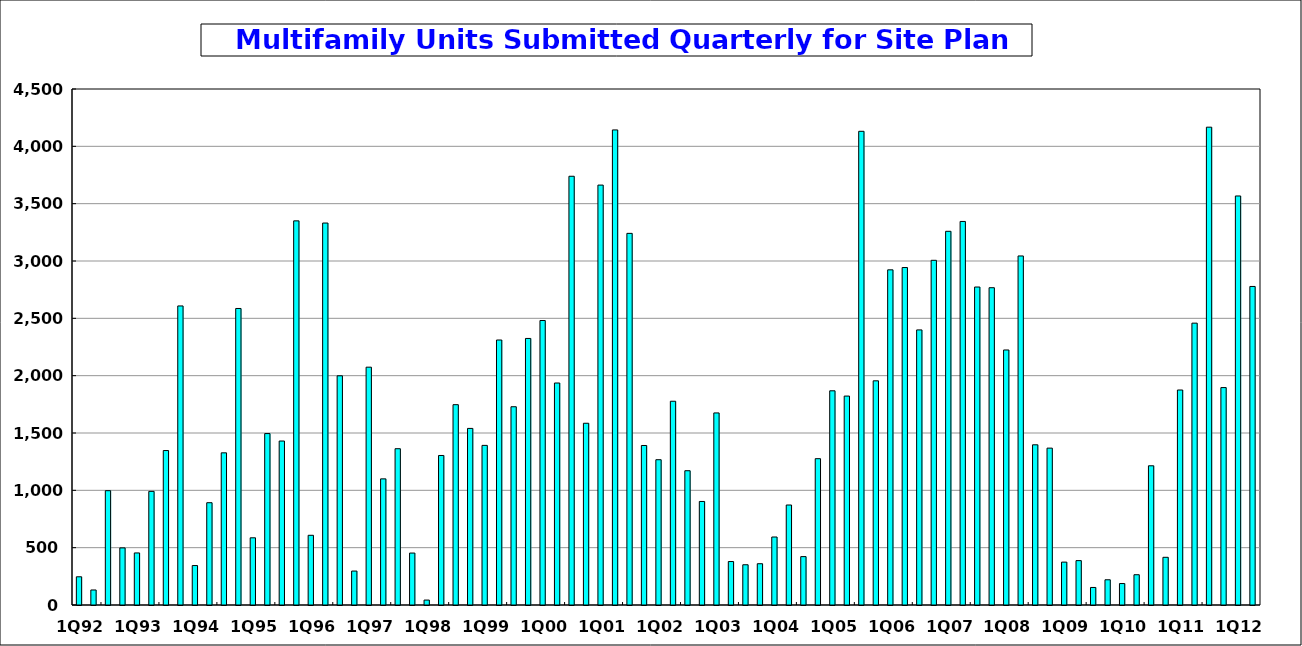
| Category | Series 0 |
|---|---|
| 1Q92 | 246 |
| 2Q92 | 131 |
| 3Q92 | 997 |
| 4Q92 | 498 |
| 1Q93 | 454 |
| 2Q93 | 991 |
| 3Q93 | 1347 |
| 4Q93 | 2608 |
| 1Q94 | 344 |
| 2Q94 | 892 |
| 3Q94 | 1327 |
| 4Q94 | 2586 |
| 1Q95 | 586 |
| 2Q95 | 1495 |
| 3Q95 | 1430 |
| 4Q95 | 3350 |
| 1Q96 | 608 |
| 2Q96 | 3331 |
| 3Q96 | 1999 |
| 4Q96 | 296 |
| 1Q97 | 2074 |
| 2Q97 | 1100 |
| 3Q97 | 1363 |
| 4Q97 | 453 |
| 1Q98 | 43 |
| 2Q98 | 1304 |
| 3Q98 | 1747 |
| 4Q98 | 1540 |
| 1Q99 | 1392 |
| 2Q99 | 2311 |
| 3Q99 | 1729 |
| 4Q99 | 2324.56 |
| 1Q00 | 2481 |
| 2Q00 | 1936 |
| 3Q00 | 3739 |
| 4Q00 | 1585 |
| 1Q01 | 3662 |
| 2Q01 | 4143 |
| 3Q01 | 3241 |
| 4Q01 | 1391 |
| 1Q02 | 1267 |
| 2Q02 | 1777 |
| 3Q02 | 1171 |
| 4Q02 | 903 |
| 1Q03 | 1675 |
| 2Q03 | 379 |
| 3Q03 | 351 |
| 4Q03 | 360 |
| 1Q04 | 593 |
| 2Q04 | 872 |
| 3Q04 | 422 |
| 4Q04 | 1276 |
| 1Q05 | 1868 |
| 2Q05 | 1822 |
| 3Q05 | 4131 |
| 4Q05 | 1955 |
| 1Q06 | 2923 |
| 2Q06 | 2943 |
| 3Q06 | 2399 |
| 4Q06 | 3006 |
| 1Q07 | 3259 |
| 2Q07 | 3345 |
| 3Q07 | 2773 |
| 4Q07 | 2767 |
| 1Q08 | 2224 |
| 2Q08 | 3044 |
| 3Q08 | 1397 |
| 4Q08 | 1368 |
| 1Q09 | 374 |
| 2Q09 | 387 |
| 3Q09 | 153 |
| 4Q09 | 220 |
| 1Q10 | 187 |
| 2Q10 | 264 |
| 3Q10 | 1214 |
| 4Q10 | 416 |
| 1Q11 | 1875 |
| 2Q11 | 2458 |
| 3Q11 | 4167 |
| 4Q11 | 1896 |
| 1Q12 | 3567 |
| 2Q12 | 2778 |